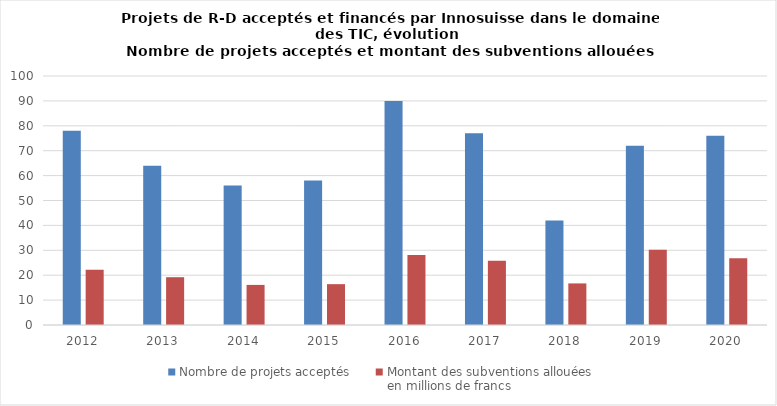
| Category | Nombre de projets acceptés  | Montant des subventions allouées 
en millions de francs |
|---|---|---|
| 2012.0 | 78 | 22.2 |
| 2013.0 | 64 | 19.2 |
| 2014.0 | 56 | 16.1 |
| 2015.0 | 58 | 16.4 |
| 2016.0 | 90 | 28.1 |
| 2017.0 | 77 | 25.8 |
| 2018.0 | 42 | 16.7 |
| 2019.0 | 72 | 30.2 |
| 2020.0 | 76 | 26.8 |